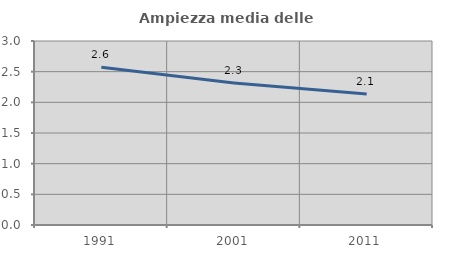
| Category | Ampiezza media delle famiglie |
|---|---|
| 1991.0 | 2.57 |
| 2001.0 | 2.316 |
| 2011.0 | 2.136 |